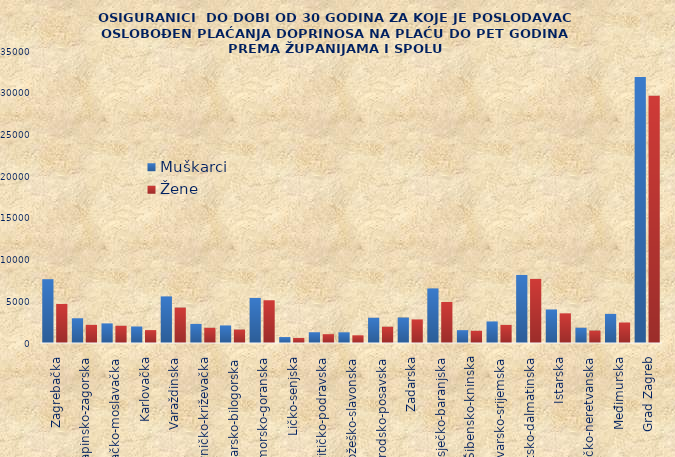
| Category | Muškarci | Žene |
|---|---|---|
| Zagrebačka | 7649 | 4687 |
| Krapinsko-zagorska | 2965 | 2176 |
| Sisačko-moslavačka | 2351 | 2067 |
| Karlovačka | 1979 | 1546 |
| Varaždinska | 5587 | 4247 |
| Koprivničko-križevačka | 2289 | 1822 |
| Bjelovarsko-bilogorska | 2106 | 1609 |
| Primorsko-goranska | 5403 | 5124 |
| Ličko-senjska | 713 | 608 |
| Virovitičko-podravska | 1290 | 1057 |
| Požeško-slavonska | 1282 | 922 |
| Brodsko-posavska | 3027 | 1953 |
| Zadarska | 3053 | 2827 |
| Osječko-baranjska | 6546 | 4919 |
| Šibensko-kninska | 1539 | 1467 |
| Vukovarsko-srijemska | 2584 | 2169 |
| Splitsko-dalmatinska | 8157 | 7684 |
| Istarska | 4020 | 3555 |
| Dubrovačko-neretvanska | 1831 | 1489 |
| Međimurska | 3493 | 2458 |
| Grad Zagreb | 31882 | 29625 |